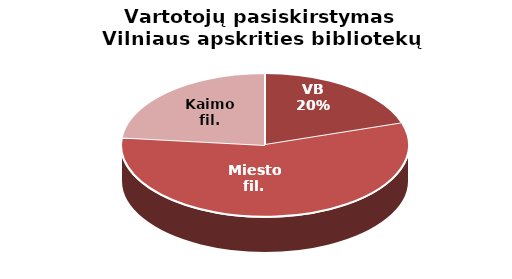
| Category | Series 0 |
|---|---|
| VB | 21057 |
| Miesto fil. | 59202 |
| Kaimo fil. | 24442 |